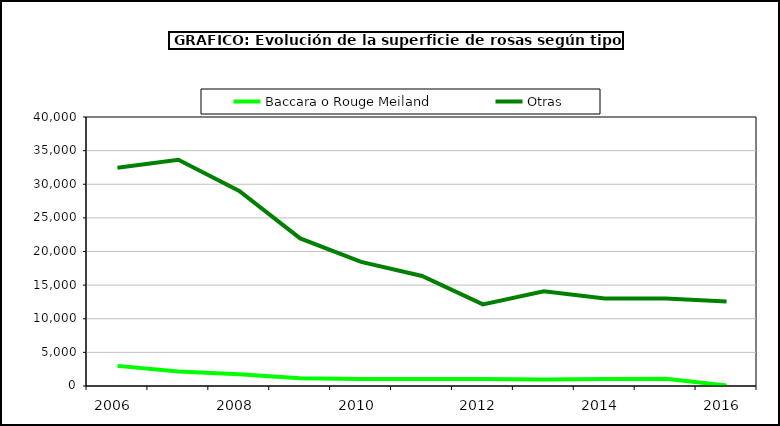
| Category | Baccara o Rouge Meiland | Otras |
|---|---|---|
| 2006.0 | 2992 | 32455 |
| 2007.0 | 2159 | 33641 |
| 2008.0 | 1760 | 29013 |
| 2009.0 | 1160 | 21945 |
| 2010.0 | 1050 | 18446 |
| 2011.0 | 1050 | 16360 |
| 2012.0 | 1050 | 12133 |
| 2013.0 | 950 | 14093 |
| 2014.0 | 1050 | 13013 |
| 2015.0 | 1070 | 13016 |
| 2016.0 | 79 | 12572 |